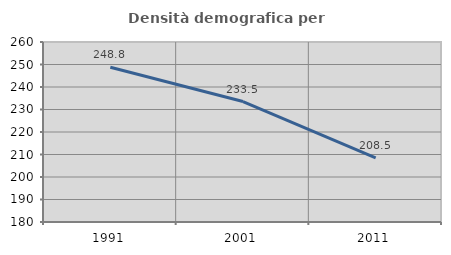
| Category | Densità demografica |
|---|---|
| 1991.0 | 248.75 |
| 2001.0 | 233.549 |
| 2011.0 | 208.474 |